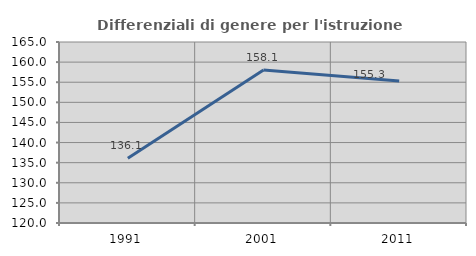
| Category | Differenziali di genere per l'istruzione superiore |
|---|---|
| 1991.0 | 136.115 |
| 2001.0 | 158.053 |
| 2011.0 | 155.29 |